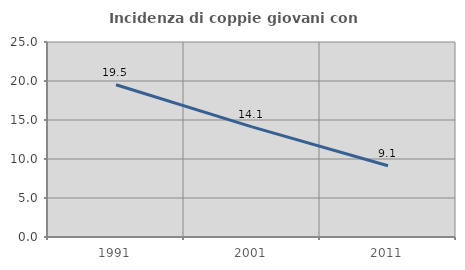
| Category | Incidenza di coppie giovani con figli |
|---|---|
| 1991.0 | 19.524 |
| 2001.0 | 14.122 |
| 2011.0 | 9.14 |